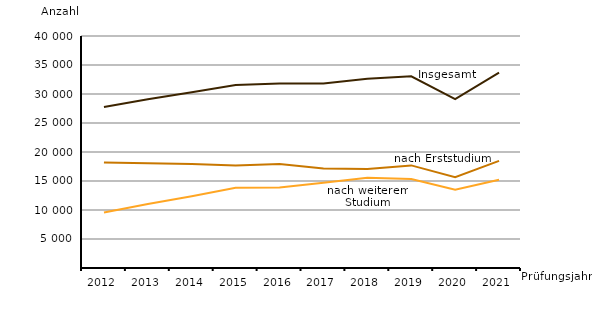
| Category | Insgesamt | nach Erststudium | nach weiterem Studium |
|---|---|---|---|
| 2012.0 | 27754 | 18182 | 9572 |
| 2013.0 | 29094 | 18046 | 11048 |
| 2014.0 | 30302 | 17918 | 12384 |
| 2015.0 | 31532 | 17683 | 13849 |
| 2016.0 | 31808 | 17914 | 13894 |
| 2017.0 | 31827 | 17141 | 14686 |
| 2018.0 | 32636 | 17073 | 15563 |
| 2019.0 | 33042 | 17689 | 15353 |
| 2020.0 | 29132 | 15638 | 13494 |
| 2021.0 | 33681 | 18464 | 15217 |